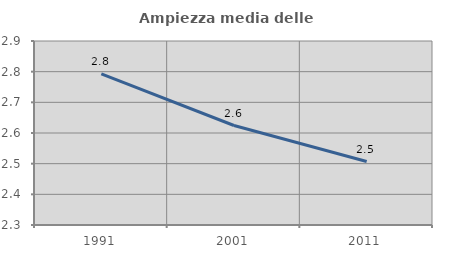
| Category | Ampiezza media delle famiglie |
|---|---|
| 1991.0 | 2.793 |
| 2001.0 | 2.624 |
| 2011.0 | 2.507 |